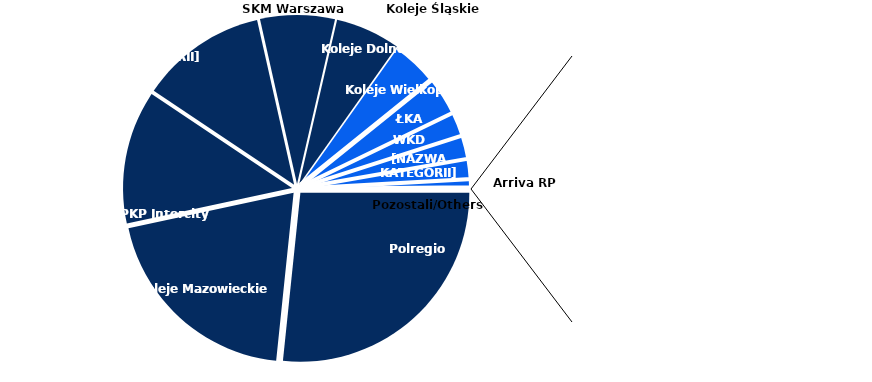
| Category | Series 0 |
|---|---|
| Polregio | 0.266 |
| Koleje Mazowieckie | 0.2 |
| PKP Intercity | 0.127 |
| PKP SKM | 0.121 |
| SKM Warszawa | 0.071 |
| Koleje Śląskie | 0.062 |
| Koleje Dolnośląskie | 0.044 |
| Koleje Wielkopolskie | 0.036 |
| ŁKA | 0.022 |
| WKD | 0.022 |
| Koleje Małopolskie | 0.019 |
| Arriva RP | 0.007 |
| Pozostali/Others | 0.002 |